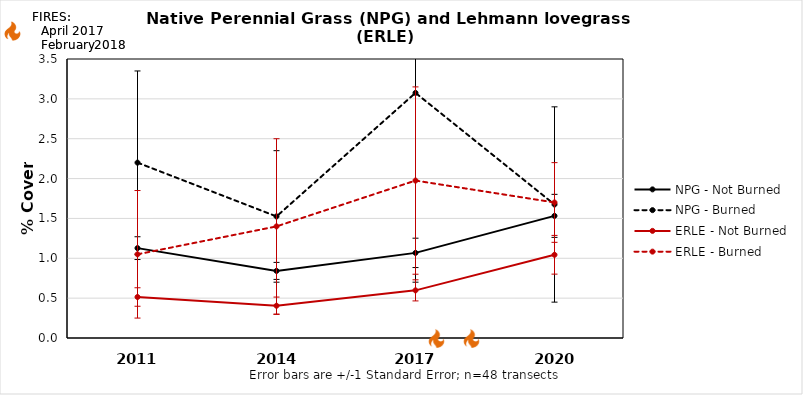
| Category | NPG - Not Burned | NPG - Burned | ERLE - Not Burned | ERLE - Burned |
|---|---|---|---|---|
| 2011.0 | 1.127 | 2.2 | 0.514 | 1.05 |
| 2014.0 | 0.842 | 1.525 | 0.405 | 1.4 |
| 2017.0 | 1.068 | 3.075 | 0.598 | 1.975 |
| 2020.0 | 1.532 | 1.675 | 1.044 | 1.7 |